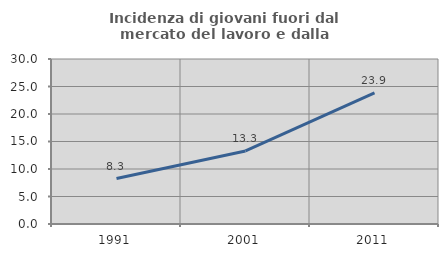
| Category | Incidenza di giovani fuori dal mercato del lavoro e dalla formazione  |
|---|---|
| 1991.0 | 8.259 |
| 2001.0 | 13.281 |
| 2011.0 | 23.861 |